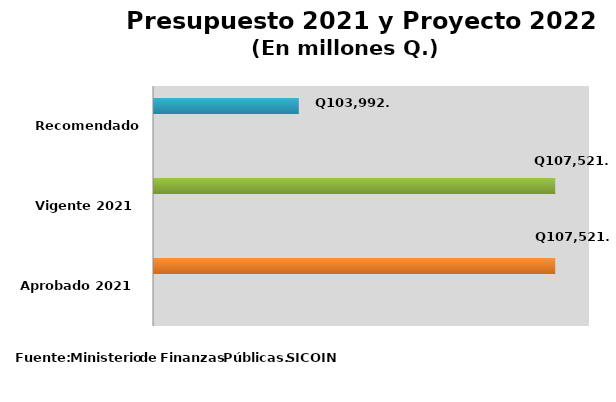
| Category | Series 0 | Series 2 | Series 3 |
|---|---|---|---|
| Aprobado 2021 |  |  | 107521.5 |
| Vigente 2021 |  |  | 107521.5 |
| Recomendado 2022 |  |  | 103992.5 |